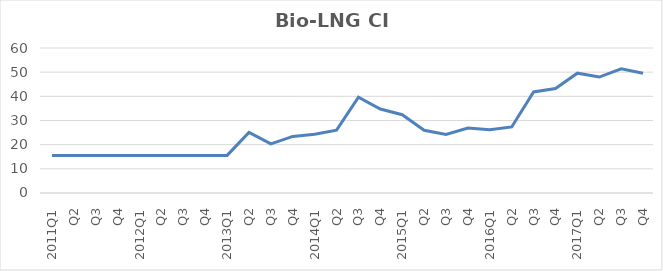
| Category | Bio-LNG CI Avg |
|---|---|
| 2011Q1 | 15.56 |
| Q2 | 15.56 |
| Q3 | 15.56 |
| Q4 | 15.56 |
| 2012Q1 | 15.56 |
| Q2 | 15.56 |
| Q3 | 15.56 |
| Q4 | 15.56 |
| 2013Q1 | 15.56 |
| Q2 | 25.06 |
| Q3 | 20.32 |
| Q4 | 23.42 |
| 2014Q1 | 24.31 |
| Q2 | 26 |
| Q3 | 39.65 |
| Q4 | 34.76 |
| 2015Q1 | 32.38 |
| Q2 | 25.96 |
| Q3 | 24.25 |
| Q4 | 26.86 |
| 2016Q1 | 26.14 |
| Q2 | 27.34 |
| Q3 | 41.83 |
| Q4 | 43.25 |
| 2017Q1 | 49.59 |
| Q2 | 47.97 |
| Q3 | 51.38 |
| Q4 | 49.57 |